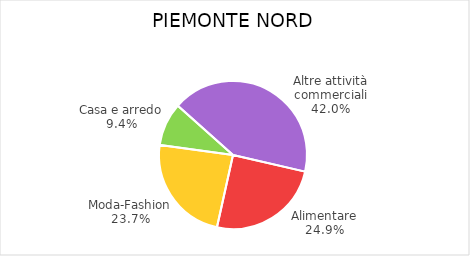
| Category | Piemonte Nord |
|---|---|
| Alimentare | 3188 |
| Moda-Fashion | 3038 |
| Casa e arredo | 1207 |
| Altre attività commerciali | 5387 |